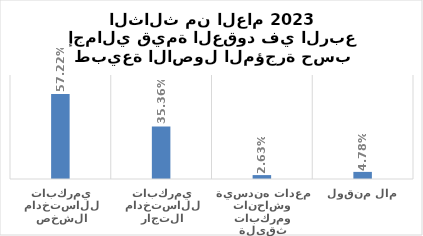
| Category | Series 0 |
|---|---|
| مركبات للاستخدام الشخصي  | 0.572 |
| مركبات للاستخدام التجاري  | 0.354 |
| معدات هندسية وشاحنات ومركبات ثقيلة | 0.026 |
| مال منقول | 0.048 |